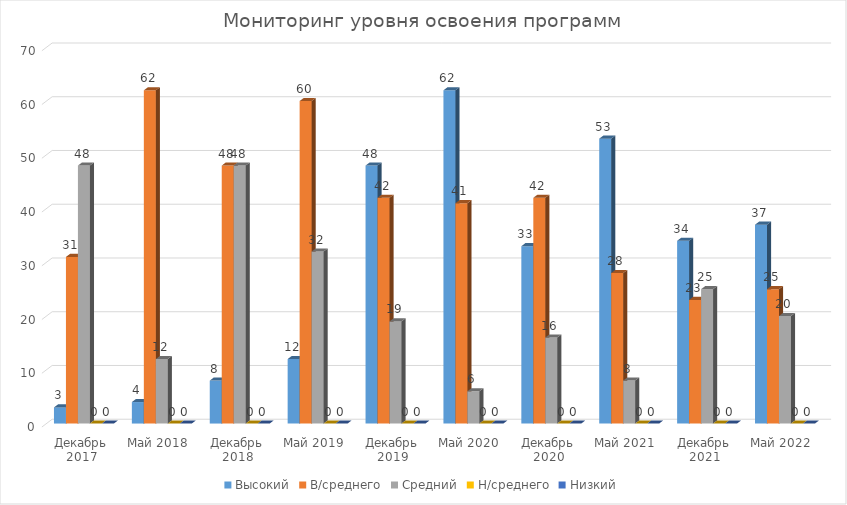
| Category | Высокий | В/среднего | Средний | Н/среднего | Низкий |
|---|---|---|---|---|---|
| Декабрь 2017 | 3 | 31 | 48 | 0 | 0 |
| Май 2018 | 4 | 62 | 12 | 0 | 0 |
| Декабрь 2018 | 8 | 48 | 48 | 0 | 0 |
| Май 2019 | 12 | 60 | 32 | 0 | 0 |
| Декабрь 2019 | 48 | 42 | 19 | 0 | 0 |
| Май 2020 | 62 | 41 | 6 | 0 | 0 |
| Декабрь 2020 | 33 | 42 | 16 | 0 | 0 |
| Май 2021 | 53 | 28 | 8 | 0 | 0 |
| Декабрь 2021 | 34 | 23 | 25 | 0 | 0 |
| Май 2022 | 37 | 25 | 20 | 0 | 0 |